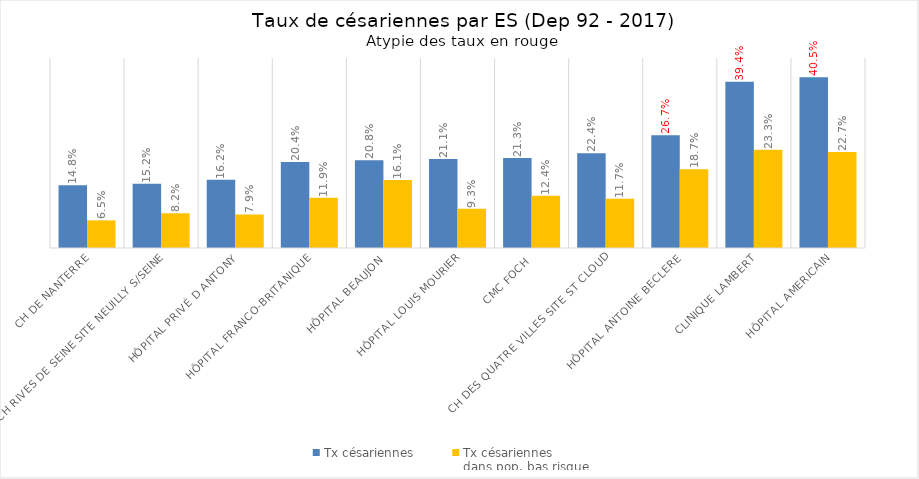
| Category | Tx césariennes | Tx césariennes 
dans pop. bas risque |
|---|---|---|
| CH DE NANTERRE | 0.148 | 0.065 |
| CH RIVES DE SEINE SITE NEUILLY S/SEINE | 0.152 | 0.082 |
| HÔPITAL PRIVÉ D ANTONY | 0.162 | 0.079 |
| HÔPITAL FRANCO-BRITANIQUE | 0.204 | 0.119 |
| HÔPITAL BEAUJON | 0.208 | 0.161 |
| HÔPITAL LOUIS MOURIER | 0.211 | 0.093 |
| CMC FOCH | 0.213 | 0.124 |
| CH DES QUATRE VILLES SITE ST CLOUD | 0.224 | 0.117 |
| HÔPITAL ANTOINE BECLERE | 0.267 | 0.187 |
| CLINIQUE LAMBERT | 0.394 | 0.233 |
| HÔPITAL AMERICAIN | 0.405 | 0.227 |